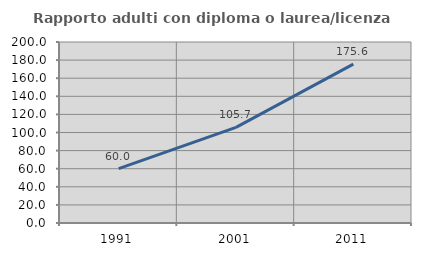
| Category | Rapporto adulti con diploma o laurea/licenza media  |
|---|---|
| 1991.0 | 60.028 |
| 2001.0 | 105.69 |
| 2011.0 | 175.575 |